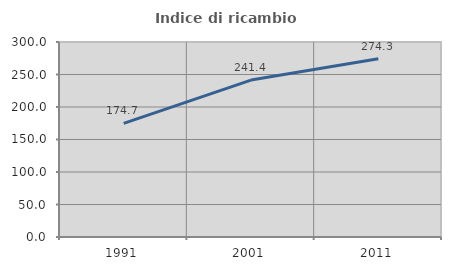
| Category | Indice di ricambio occupazionale  |
|---|---|
| 1991.0 | 174.699 |
| 2001.0 | 241.42 |
| 2011.0 | 274.265 |